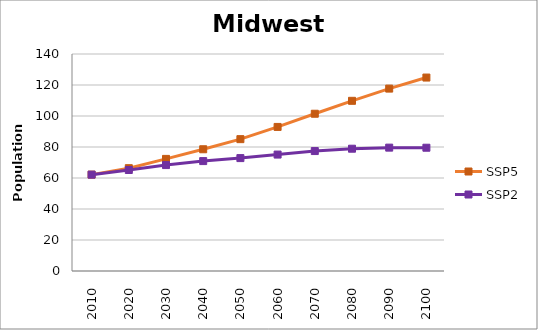
| Category | SSP5 | SSP2 |
|---|---|---|
| 2010.0 | 62168745 | 62168745 |
| 2020.0 | 66338833 | 65159560 |
| 2030.0 | 72327734 | 68344446 |
| 2040.0 | 78547280 | 70908118 |
| 2050.0 | 85063773 | 72838679 |
| 2060.0 | 92948905 | 75120828 |
| 2070.0 | 101460627 | 77385788 |
| 2080.0 | 109790466 | 78893052 |
| 2090.0 | 117675251 | 79587063 |
| 2100.0 | 124800579 | 79536154 |